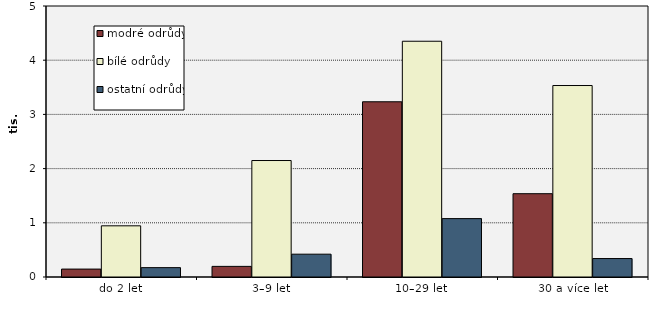
| Category | modré odrůdy | bílé odrůdy | ostatní odrůdy |
|---|---|---|---|
| do 2 let | 146.088 | 944.392 | 172.937 |
| 3–9 let | 195.987 | 2149.112 | 420.942 |
| 10–29 let | 3233.074 | 4349.73 | 1077.04 |
| 30 a více let | 1536.893 | 3532.732 | 340.438 |